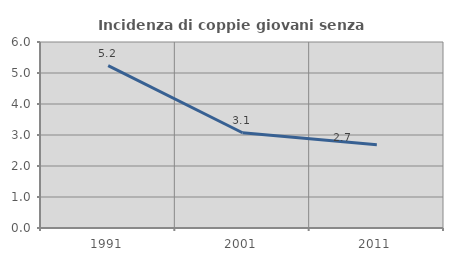
| Category | Incidenza di coppie giovani senza figli |
|---|---|
| 1991.0 | 5.236 |
| 2001.0 | 3.072 |
| 2011.0 | 2.687 |